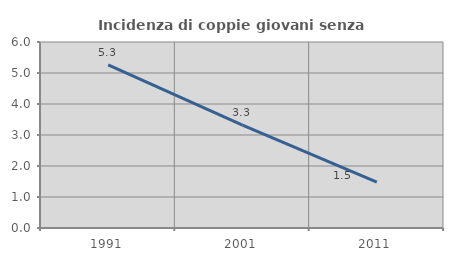
| Category | Incidenza di coppie giovani senza figli |
|---|---|
| 1991.0 | 5.263 |
| 2001.0 | 3.318 |
| 2011.0 | 1.478 |